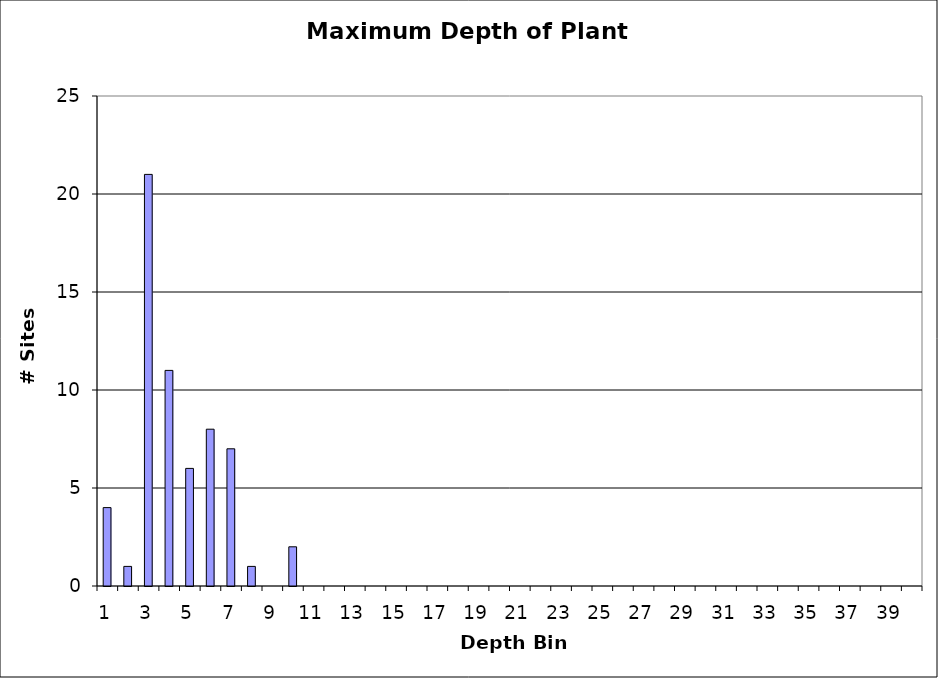
| Category | Series 0 |
|---|---|
| 1.0 | 4 |
| 2.0 | 1 |
| 3.0 | 21 |
| 4.0 | 11 |
| 5.0 | 6 |
| 6.0 | 8 |
| 7.0 | 7 |
| 8.0 | 1 |
| 9.0 | 0 |
| 10.0 | 2 |
| 11.0 | 0 |
| 12.0 | 0 |
| 13.0 | 0 |
| 14.0 | 0 |
| 15.0 | 0 |
| 16.0 | 0 |
| 17.0 | 0 |
| 18.0 | 0 |
| 19.0 | 0 |
| 20.0 | 0 |
| 21.0 | 0 |
| 22.0 | 0 |
| 23.0 | 0 |
| 24.0 | 0 |
| 25.0 | 0 |
| 26.0 | 0 |
| 27.0 | 0 |
| 28.0 | 0 |
| 29.0 | 0 |
| 30.0 | 0 |
| 31.0 | 0 |
| 32.0 | 0 |
| 33.0 | 0 |
| 34.0 | 0 |
| 35.0 | 0 |
| 36.0 | 0 |
| 37.0 | 0 |
| 38.0 | 0 |
| 39.0 | 0 |
| 40.0 | 0 |